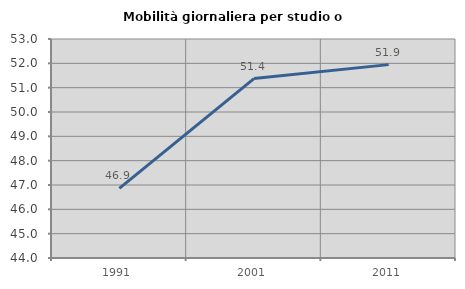
| Category | Mobilità giornaliera per studio o lavoro |
|---|---|
| 1991.0 | 46.859 |
| 2001.0 | 51.374 |
| 2011.0 | 51.947 |